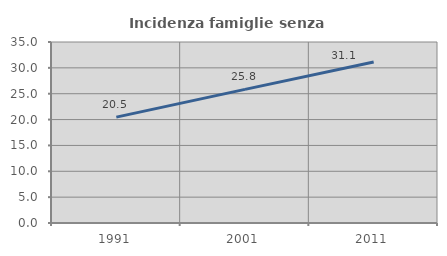
| Category | Incidenza famiglie senza nuclei |
|---|---|
| 1991.0 | 20.469 |
| 2001.0 | 25.837 |
| 2011.0 | 31.124 |